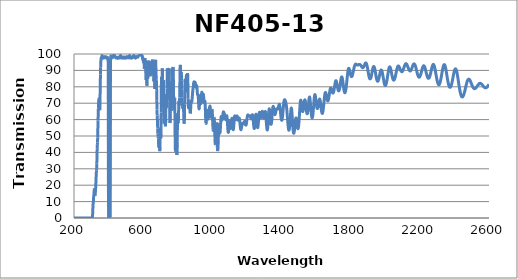
| Category | Transmission (%) |
|---|---|
| 2600.0 | 81.505 |
| 2599.0 | 81.325 |
| 2598.0 | 81.17 |
| 2597.0 | 81.029 |
| 2596.0 | 80.885 |
| 2595.0 | 80.709 |
| 2594.0 | 80.532 |
| 2593.0 | 80.373 |
| 2592.0 | 80.257 |
| 2591.0 | 80.102 |
| 2590.0 | 80.004 |
| 2589.0 | 79.88 |
| 2588.0 | 79.753 |
| 2587.0 | 79.691 |
| 2586.0 | 79.643 |
| 2585.0 | 79.518 |
| 2584.0 | 79.455 |
| 2583.0 | 79.403 |
| 2582.0 | 79.368 |
| 2581.0 | 79.414 |
| 2580.0 | 79.416 |
| 2579.0 | 79.408 |
| 2578.0 | 79.425 |
| 2577.0 | 79.477 |
| 2576.0 | 79.51 |
| 2575.0 | 79.573 |
| 2574.0 | 79.657 |
| 2573.0 | 79.706 |
| 2572.0 | 79.767 |
| 2571.0 | 79.872 |
| 2570.0 | 79.978 |
| 2569.0 | 80.113 |
| 2568.0 | 80.265 |
| 2567.0 | 80.411 |
| 2566.0 | 80.523 |
| 2565.0 | 80.657 |
| 2564.0 | 80.805 |
| 2563.0 | 80.95 |
| 2562.0 | 81.07 |
| 2561.0 | 81.199 |
| 2560.0 | 81.279 |
| 2559.0 | 81.383 |
| 2558.0 | 81.515 |
| 2557.0 | 81.59 |
| 2556.0 | 81.71 |
| 2555.0 | 81.803 |
| 2554.0 | 81.86 |
| 2553.0 | 81.938 |
| 2552.0 | 82.026 |
| 2551.0 | 82.08 |
| 2550.0 | 82.109 |
| 2549.0 | 82.13 |
| 2548.0 | 82.127 |
| 2547.0 | 82.061 |
| 2546.0 | 82.042 |
| 2545.0 | 82.046 |
| 2544.0 | 81.984 |
| 2543.0 | 81.902 |
| 2542.0 | 81.758 |
| 2541.0 | 81.629 |
| 2540.0 | 81.528 |
| 2539.0 | 81.471 |
| 2538.0 | 81.338 |
| 2537.0 | 81.219 |
| 2536.0 | 81.086 |
| 2535.0 | 80.915 |
| 2534.0 | 80.765 |
| 2533.0 | 80.627 |
| 2532.0 | 80.444 |
| 2531.0 | 80.249 |
| 2530.0 | 80.106 |
| 2529.0 | 79.963 |
| 2528.0 | 79.822 |
| 2527.0 | 79.716 |
| 2526.0 | 79.588 |
| 2525.0 | 79.464 |
| 2524.0 | 79.321 |
| 2523.0 | 79.19 |
| 2522.0 | 79.11 |
| 2521.0 | 79.058 |
| 2520.0 | 78.983 |
| 2519.0 | 78.946 |
| 2518.0 | 78.883 |
| 2517.0 | 78.867 |
| 2516.0 | 78.882 |
| 2515.0 | 78.927 |
| 2514.0 | 78.976 |
| 2513.0 | 79.034 |
| 2512.0 | 79.098 |
| 2511.0 | 79.187 |
| 2510.0 | 79.292 |
| 2509.0 | 79.455 |
| 2508.0 | 79.605 |
| 2507.0 | 79.755 |
| 2506.0 | 79.957 |
| 2505.0 | 80.179 |
| 2504.0 | 80.404 |
| 2503.0 | 80.652 |
| 2502.0 | 80.933 |
| 2501.0 | 81.179 |
| 2500.0 | 81.432 |
| 2499.0 | 81.675 |
| 2498.0 | 81.961 |
| 2497.0 | 82.24 |
| 2496.0 | 82.509 |
| 2495.0 | 82.776 |
| 2494.0 | 83.036 |
| 2493.0 | 83.261 |
| 2492.0 | 83.491 |
| 2491.0 | 83.715 |
| 2490.0 | 83.932 |
| 2489.0 | 84.124 |
| 2488.0 | 84.285 |
| 2487.0 | 84.411 |
| 2486.0 | 84.506 |
| 2485.0 | 84.6 |
| 2484.0 | 84.663 |
| 2483.0 | 84.667 |
| 2482.0 | 84.665 |
| 2481.0 | 84.608 |
| 2480.0 | 84.511 |
| 2479.0 | 84.399 |
| 2478.0 | 84.261 |
| 2477.0 | 84.068 |
| 2476.0 | 83.877 |
| 2475.0 | 83.631 |
| 2474.0 | 83.328 |
| 2473.0 | 83.002 |
| 2472.0 | 82.655 |
| 2471.0 | 82.271 |
| 2470.0 | 81.857 |
| 2469.0 | 81.446 |
| 2468.0 | 81.026 |
| 2467.0 | 80.596 |
| 2466.0 | 80.125 |
| 2465.0 | 79.645 |
| 2464.0 | 79.175 |
| 2463.0 | 78.736 |
| 2462.0 | 78.271 |
| 2461.0 | 77.819 |
| 2460.0 | 77.394 |
| 2459.0 | 76.996 |
| 2458.0 | 76.594 |
| 2457.0 | 76.221 |
| 2456.0 | 75.868 |
| 2455.0 | 75.517 |
| 2454.0 | 75.199 |
| 2453.0 | 74.909 |
| 2452.0 | 74.654 |
| 2451.0 | 74.422 |
| 2450.0 | 74.24 |
| 2449.0 | 74.1 |
| 2448.0 | 73.976 |
| 2447.0 | 73.879 |
| 2446.0 | 73.823 |
| 2445.0 | 73.828 |
| 2444.0 | 73.857 |
| 2443.0 | 73.939 |
| 2442.0 | 74.049 |
| 2441.0 | 74.206 |
| 2440.0 | 74.399 |
| 2439.0 | 74.628 |
| 2438.0 | 74.918 |
| 2437.0 | 75.265 |
| 2436.0 | 75.65 |
| 2435.0 | 76.057 |
| 2434.0 | 76.501 |
| 2433.0 | 76.994 |
| 2432.0 | 77.513 |
| 2431.0 | 78.064 |
| 2430.0 | 78.665 |
| 2429.0 | 79.292 |
| 2428.0 | 79.911 |
| 2427.0 | 80.556 |
| 2426.0 | 81.233 |
| 2425.0 | 81.949 |
| 2424.0 | 82.669 |
| 2423.0 | 83.368 |
| 2422.0 | 84.075 |
| 2421.0 | 84.778 |
| 2420.0 | 85.47 |
| 2419.0 | 86.127 |
| 2418.0 | 86.767 |
| 2417.0 | 87.406 |
| 2416.0 | 87.996 |
| 2415.0 | 88.53 |
| 2414.0 | 89.01 |
| 2413.0 | 89.428 |
| 2412.0 | 89.811 |
| 2411.0 | 90.143 |
| 2410.0 | 90.417 |
| 2409.0 | 90.65 |
| 2408.0 | 90.827 |
| 2407.0 | 90.922 |
| 2406.0 | 90.951 |
| 2405.0 | 90.899 |
| 2404.0 | 90.793 |
| 2403.0 | 90.626 |
| 2402.0 | 90.402 |
| 2401.0 | 90.124 |
| 2400.0 | 89.799 |
| 2399.0 | 89.415 |
| 2398.0 | 88.984 |
| 2397.0 | 88.524 |
| 2396.0 | 88.029 |
| 2395.0 | 87.504 |
| 2394.0 | 86.965 |
| 2393.0 | 86.405 |
| 2392.0 | 85.833 |
| 2391.0 | 85.267 |
| 2390.0 | 84.705 |
| 2389.0 | 84.138 |
| 2388.0 | 83.595 |
| 2387.0 | 83.078 |
| 2386.0 | 82.586 |
| 2385.0 | 82.103 |
| 2384.0 | 81.663 |
| 2383.0 | 81.265 |
| 2382.0 | 80.892 |
| 2381.0 | 80.572 |
| 2380.0 | 80.294 |
| 2379.0 | 80.064 |
| 2378.0 | 79.902 |
| 2377.0 | 79.772 |
| 2376.0 | 79.693 |
| 2375.0 | 79.665 |
| 2374.0 | 79.679 |
| 2373.0 | 79.739 |
| 2372.0 | 79.866 |
| 2371.0 | 80.029 |
| 2370.0 | 80.21 |
| 2369.0 | 80.454 |
| 2368.0 | 80.756 |
| 2367.0 | 81.091 |
| 2366.0 | 81.476 |
| 2365.0 | 81.931 |
| 2364.0 | 82.432 |
| 2363.0 | 82.922 |
| 2362.0 | 83.446 |
| 2361.0 | 84.02 |
| 2360.0 | 84.632 |
| 2359.0 | 85.286 |
| 2358.0 | 85.937 |
| 2357.0 | 86.585 |
| 2356.0 | 87.237 |
| 2355.0 | 87.923 |
| 2354.0 | 88.568 |
| 2353.0 | 89.222 |
| 2352.0 | 89.856 |
| 2351.0 | 90.472 |
| 2350.0 | 91.02 |
| 2349.0 | 91.53 |
| 2348.0 | 91.994 |
| 2347.0 | 92.431 |
| 2346.0 | 92.778 |
| 2345.0 | 93.046 |
| 2344.0 | 93.255 |
| 2343.0 | 93.433 |
| 2342.0 | 93.522 |
| 2341.0 | 93.52 |
| 2340.0 | 93.434 |
| 2339.0 | 93.32 |
| 2338.0 | 93.139 |
| 2337.0 | 92.886 |
| 2336.0 | 92.553 |
| 2335.0 | 92.158 |
| 2334.0 | 91.75 |
| 2333.0 | 91.283 |
| 2332.0 | 90.784 |
| 2331.0 | 90.245 |
| 2330.0 | 89.708 |
| 2329.0 | 89.118 |
| 2328.0 | 88.506 |
| 2327.0 | 87.868 |
| 2326.0 | 87.291 |
| 2325.0 | 86.664 |
| 2324.0 | 86.088 |
| 2323.0 | 85.506 |
| 2322.0 | 84.932 |
| 2321.0 | 84.404 |
| 2320.0 | 83.891 |
| 2319.0 | 83.404 |
| 2318.0 | 82.998 |
| 2317.0 | 82.629 |
| 2316.0 | 82.276 |
| 2315.0 | 81.95 |
| 2314.0 | 81.702 |
| 2313.0 | 81.476 |
| 2312.0 | 81.338 |
| 2311.0 | 81.286 |
| 2310.0 | 81.269 |
| 2309.0 | 81.293 |
| 2308.0 | 81.341 |
| 2307.0 | 81.485 |
| 2306.0 | 81.677 |
| 2305.0 | 81.931 |
| 2304.0 | 82.213 |
| 2303.0 | 82.566 |
| 2302.0 | 82.92 |
| 2301.0 | 83.36 |
| 2300.0 | 83.825 |
| 2299.0 | 84.349 |
| 2298.0 | 84.864 |
| 2297.0 | 85.427 |
| 2296.0 | 86.002 |
| 2295.0 | 86.581 |
| 2294.0 | 87.191 |
| 2293.0 | 87.789 |
| 2292.0 | 88.376 |
| 2291.0 | 88.966 |
| 2290.0 | 89.537 |
| 2289.0 | 90.091 |
| 2288.0 | 90.642 |
| 2287.0 | 91.156 |
| 2286.0 | 91.634 |
| 2285.0 | 92.08 |
| 2284.0 | 92.471 |
| 2283.0 | 92.81 |
| 2282.0 | 93.115 |
| 2281.0 | 93.344 |
| 2280.0 | 93.5 |
| 2279.0 | 93.62 |
| 2278.0 | 93.677 |
| 2277.0 | 93.631 |
| 2276.0 | 93.508 |
| 2275.0 | 93.35 |
| 2274.0 | 93.147 |
| 2273.0 | 92.903 |
| 2272.0 | 92.579 |
| 2271.0 | 92.209 |
| 2270.0 | 91.84 |
| 2269.0 | 91.4 |
| 2268.0 | 90.937 |
| 2267.0 | 90.468 |
| 2266.0 | 90.032 |
| 2265.0 | 89.496 |
| 2264.0 | 89.024 |
| 2263.0 | 88.556 |
| 2262.0 | 88.095 |
| 2261.0 | 87.675 |
| 2260.0 | 87.276 |
| 2259.0 | 86.876 |
| 2258.0 | 86.531 |
| 2257.0 | 86.218 |
| 2256.0 | 85.915 |
| 2255.0 | 85.703 |
| 2254.0 | 85.489 |
| 2253.0 | 85.335 |
| 2252.0 | 85.246 |
| 2251.0 | 85.195 |
| 2250.0 | 85.169 |
| 2249.0 | 85.183 |
| 2248.0 | 85.266 |
| 2247.0 | 85.405 |
| 2246.0 | 85.595 |
| 2245.0 | 85.775 |
| 2244.0 | 85.998 |
| 2243.0 | 86.243 |
| 2242.0 | 86.615 |
| 2241.0 | 86.948 |
| 2240.0 | 87.346 |
| 2239.0 | 87.733 |
| 2238.0 | 88.147 |
| 2237.0 | 88.592 |
| 2236.0 | 89.016 |
| 2235.0 | 89.464 |
| 2234.0 | 89.933 |
| 2233.0 | 90.358 |
| 2232.0 | 90.762 |
| 2231.0 | 91.135 |
| 2230.0 | 91.485 |
| 2229.0 | 91.822 |
| 2228.0 | 92.101 |
| 2227.0 | 92.36 |
| 2226.0 | 92.547 |
| 2225.0 | 92.667 |
| 2224.0 | 92.784 |
| 2223.0 | 92.824 |
| 2222.0 | 92.825 |
| 2221.0 | 92.78 |
| 2220.0 | 92.629 |
| 2219.0 | 92.437 |
| 2218.0 | 92.26 |
| 2217.0 | 91.982 |
| 2216.0 | 91.714 |
| 2215.0 | 91.404 |
| 2214.0 | 91.047 |
| 2213.0 | 90.668 |
| 2212.0 | 90.323 |
| 2211.0 | 89.85 |
| 2210.0 | 89.45 |
| 2209.0 | 89.045 |
| 2208.0 | 88.653 |
| 2207.0 | 88.267 |
| 2206.0 | 87.926 |
| 2205.0 | 87.549 |
| 2204.0 | 87.228 |
| 2203.0 | 86.936 |
| 2202.0 | 86.673 |
| 2201.0 | 86.442 |
| 2200.0 | 86.254 |
| 2199.0 | 86.066 |
| 2198.0 | 85.96 |
| 2197.0 | 85.886 |
| 2196.0 | 85.871 |
| 2195.0 | 85.873 |
| 2194.0 | 85.923 |
| 2193.0 | 86.076 |
| 2192.0 | 86.207 |
| 2191.0 | 86.397 |
| 2190.0 | 86.634 |
| 2189.0 | 86.908 |
| 2188.0 | 87.21 |
| 2187.0 | 87.525 |
| 2186.0 | 87.913 |
| 2185.0 | 88.317 |
| 2184.0 | 88.72 |
| 2183.0 | 89.176 |
| 2182.0 | 89.619 |
| 2181.0 | 90.054 |
| 2180.0 | 90.512 |
| 2179.0 | 90.931 |
| 2178.0 | 91.335 |
| 2177.0 | 91.761 |
| 2176.0 | 92.131 |
| 2175.0 | 92.507 |
| 2174.0 | 92.831 |
| 2173.0 | 93.097 |
| 2172.0 | 93.356 |
| 2171.0 | 93.554 |
| 2170.0 | 93.707 |
| 2169.0 | 93.842 |
| 2168.0 | 93.918 |
| 2167.0 | 93.982 |
| 2166.0 | 93.955 |
| 2165.0 | 93.922 |
| 2164.0 | 93.813 |
| 2163.0 | 93.669 |
| 2162.0 | 93.48 |
| 2161.0 | 93.247 |
| 2160.0 | 93.051 |
| 2159.0 | 92.78 |
| 2158.0 | 92.527 |
| 2157.0 | 92.229 |
| 2156.0 | 91.919 |
| 2155.0 | 91.62 |
| 2154.0 | 91.31 |
| 2153.0 | 91.038 |
| 2152.0 | 90.786 |
| 2151.0 | 90.55 |
| 2150.0 | 90.323 |
| 2149.0 | 90.13 |
| 2148.0 | 89.964 |
| 2147.0 | 89.812 |
| 2146.0 | 89.735 |
| 2145.0 | 89.673 |
| 2144.0 | 89.657 |
| 2143.0 | 89.671 |
| 2142.0 | 89.72 |
| 2141.0 | 89.806 |
| 2140.0 | 89.933 |
| 2139.0 | 90.066 |
| 2138.0 | 90.257 |
| 2137.0 | 90.47 |
| 2136.0 | 90.693 |
| 2135.0 | 90.958 |
| 2134.0 | 91.221 |
| 2133.0 | 91.495 |
| 2132.0 | 91.777 |
| 2131.0 | 92.078 |
| 2130.0 | 92.375 |
| 2129.0 | 92.673 |
| 2128.0 | 92.894 |
| 2127.0 | 93.145 |
| 2126.0 | 93.387 |
| 2125.0 | 93.62 |
| 2124.0 | 93.807 |
| 2123.0 | 93.931 |
| 2122.0 | 94.027 |
| 2121.0 | 94.088 |
| 2120.0 | 94.12 |
| 2119.0 | 94.115 |
| 2118.0 | 94.046 |
| 2117.0 | 93.924 |
| 2116.0 | 93.768 |
| 2115.0 | 93.599 |
| 2114.0 | 93.392 |
| 2113.0 | 93.168 |
| 2112.0 | 92.896 |
| 2111.0 | 92.582 |
| 2110.0 | 92.283 |
| 2109.0 | 91.966 |
| 2108.0 | 91.624 |
| 2107.0 | 91.301 |
| 2106.0 | 91.007 |
| 2105.0 | 90.713 |
| 2104.0 | 90.436 |
| 2103.0 | 90.165 |
| 2102.0 | 89.909 |
| 2101.0 | 89.713 |
| 2100.0 | 89.541 |
| 2099.0 | 89.406 |
| 2098.0 | 89.297 |
| 2097.0 | 89.21 |
| 2096.0 | 89.199 |
| 2095.0 | 89.224 |
| 2094.0 | 89.289 |
| 2093.0 | 89.397 |
| 2092.0 | 89.531 |
| 2091.0 | 89.672 |
| 2090.0 | 89.82 |
| 2089.0 | 89.996 |
| 2088.0 | 90.218 |
| 2087.0 | 90.509 |
| 2086.0 | 90.782 |
| 2085.0 | 91.065 |
| 2084.0 | 91.31 |
| 2083.0 | 91.564 |
| 2082.0 | 91.793 |
| 2081.0 | 92.022 |
| 2080.0 | 92.269 |
| 2079.0 | 92.462 |
| 2078.0 | 92.597 |
| 2077.0 | 92.691 |
| 2076.0 | 92.731 |
| 2075.0 | 92.71 |
| 2074.0 | 92.637 |
| 2073.0 | 92.522 |
| 2072.0 | 92.366 |
| 2071.0 | 92.118 |
| 2070.0 | 91.825 |
| 2069.0 | 91.478 |
| 2068.0 | 91.078 |
| 2067.0 | 90.654 |
| 2066.0 | 90.193 |
| 2065.0 | 89.69 |
| 2064.0 | 89.182 |
| 2063.0 | 88.652 |
| 2062.0 | 88.115 |
| 2061.0 | 87.611 |
| 2060.0 | 87.128 |
| 2059.0 | 86.646 |
| 2058.0 | 86.181 |
| 2057.0 | 85.746 |
| 2056.0 | 85.338 |
| 2055.0 | 84.996 |
| 2054.0 | 84.741 |
| 2053.0 | 84.511 |
| 2052.0 | 84.299 |
| 2051.0 | 84.145 |
| 2050.0 | 84.072 |
| 2049.0 | 84.042 |
| 2048.0 | 84.071 |
| 2047.0 | 84.171 |
| 2046.0 | 84.346 |
| 2045.0 | 84.565 |
| 2044.0 | 84.823 |
| 2043.0 | 85.153 |
| 2042.0 | 85.554 |
| 2041.0 | 86.015 |
| 2040.0 | 86.502 |
| 2039.0 | 86.973 |
| 2038.0 | 87.482 |
| 2037.0 | 88.023 |
| 2036.0 | 88.598 |
| 2035.0 | 89.177 |
| 2034.0 | 89.708 |
| 2033.0 | 90.196 |
| 2032.0 | 90.659 |
| 2031.0 | 91.089 |
| 2030.0 | 91.445 |
| 2029.0 | 91.746 |
| 2028.0 | 91.975 |
| 2027.0 | 92.117 |
| 2026.0 | 92.162 |
| 2025.0 | 92.107 |
| 2024.0 | 91.984 |
| 2023.0 | 91.776 |
| 2022.0 | 91.469 |
| 2021.0 | 91.082 |
| 2020.0 | 90.583 |
| 2019.0 | 90.011 |
| 2018.0 | 89.407 |
| 2017.0 | 88.752 |
| 2016.0 | 88.108 |
| 2015.0 | 87.445 |
| 2014.0 | 86.761 |
| 2013.0 | 86.085 |
| 2012.0 | 85.383 |
| 2011.0 | 84.731 |
| 2010.0 | 84.12 |
| 2009.0 | 83.534 |
| 2008.0 | 82.977 |
| 2007.0 | 82.463 |
| 2006.0 | 82.01 |
| 2005.0 | 81.628 |
| 2004.0 | 81.321 |
| 2003.0 | 81.071 |
| 2002.0 | 80.902 |
| 2001.0 | 80.811 |
| 2000.0 | 80.783 |
| 1999.0 | 80.832 |
| 1998.0 | 80.968 |
| 1997.0 | 81.2 |
| 1996.0 | 81.491 |
| 1995.0 | 81.842 |
| 1994.0 | 82.261 |
| 1993.0 | 82.78 |
| 1992.0 | 83.34 |
| 1991.0 | 83.91 |
| 1990.0 | 84.527 |
| 1989.0 | 85.172 |
| 1988.0 | 85.806 |
| 1987.0 | 86.436 |
| 1986.0 | 87.053 |
| 1985.0 | 87.657 |
| 1984.0 | 88.236 |
| 1983.0 | 88.751 |
| 1982.0 | 89.198 |
| 1981.0 | 89.582 |
| 1980.0 | 89.881 |
| 1979.0 | 90.078 |
| 1978.0 | 90.212 |
| 1977.0 | 90.269 |
| 1976.0 | 90.254 |
| 1975.0 | 90.134 |
| 1974.0 | 89.926 |
| 1973.0 | 89.647 |
| 1972.0 | 89.301 |
| 1971.0 | 88.906 |
| 1970.0 | 88.434 |
| 1969.0 | 87.938 |
| 1968.0 | 87.451 |
| 1967.0 | 86.967 |
| 1966.0 | 86.441 |
| 1965.0 | 85.919 |
| 1964.0 | 85.417 |
| 1963.0 | 84.992 |
| 1962.0 | 84.55 |
| 1961.0 | 84.181 |
| 1960.0 | 83.904 |
| 1959.0 | 83.68 |
| 1958.0 | 83.479 |
| 1957.0 | 83.374 |
| 1956.0 | 83.357 |
| 1955.0 | 83.404 |
| 1954.0 | 83.526 |
| 1953.0 | 83.758 |
| 1952.0 | 84.025 |
| 1951.0 | 84.372 |
| 1950.0 | 84.778 |
| 1949.0 | 85.29 |
| 1948.0 | 85.779 |
| 1947.0 | 86.368 |
| 1946.0 | 86.995 |
| 1945.0 | 87.593 |
| 1944.0 | 88.262 |
| 1943.0 | 88.885 |
| 1942.0 | 89.445 |
| 1941.0 | 90.051 |
| 1940.0 | 90.615 |
| 1939.0 | 91.135 |
| 1938.0 | 91.515 |
| 1937.0 | 91.824 |
| 1936.0 | 92.082 |
| 1935.0 | 92.285 |
| 1934.0 | 92.384 |
| 1933.0 | 92.388 |
| 1932.0 | 92.29 |
| 1931.0 | 92.096 |
| 1930.0 | 91.86 |
| 1929.0 | 91.542 |
| 1928.0 | 91.113 |
| 1927.0 | 90.635 |
| 1926.0 | 90.115 |
| 1925.0 | 89.559 |
| 1924.0 | 89.024 |
| 1923.0 | 88.507 |
| 1922.0 | 87.985 |
| 1921.0 | 87.402 |
| 1920.0 | 86.801 |
| 1919.0 | 86.281 |
| 1918.0 | 85.857 |
| 1917.0 | 85.467 |
| 1916.0 | 85.239 |
| 1915.0 | 85.085 |
| 1914.0 | 84.956 |
| 1913.0 | 84.851 |
| 1912.0 | 84.801 |
| 1911.0 | 84.857 |
| 1910.0 | 84.981 |
| 1909.0 | 85.197 |
| 1908.0 | 85.51 |
| 1907.0 | 85.846 |
| 1906.0 | 86.362 |
| 1905.0 | 86.854 |
| 1904.0 | 87.409 |
| 1903.0 | 87.961 |
| 1902.0 | 88.543 |
| 1901.0 | 89.161 |
| 1900.0 | 89.839 |
| 1899.0 | 90.473 |
| 1898.0 | 91.148 |
| 1897.0 | 91.701 |
| 1896.0 | 92.193 |
| 1895.0 | 92.663 |
| 1894.0 | 93.124 |
| 1893.0 | 93.532 |
| 1892.0 | 93.876 |
| 1891.0 | 94.156 |
| 1890.0 | 94.328 |
| 1889.0 | 94.433 |
| 1888.0 | 94.519 |
| 1887.0 | 94.535 |
| 1886.0 | 94.472 |
| 1885.0 | 94.388 |
| 1884.0 | 94.213 |
| 1883.0 | 93.964 |
| 1882.0 | 93.768 |
| 1881.0 | 93.538 |
| 1880.0 | 93.245 |
| 1879.0 | 93.034 |
| 1878.0 | 92.809 |
| 1877.0 | 92.557 |
| 1876.0 | 92.334 |
| 1875.0 | 92.173 |
| 1874.0 | 91.978 |
| 1873.0 | 91.878 |
| 1872.0 | 91.741 |
| 1871.0 | 91.657 |
| 1870.0 | 91.628 |
| 1869.0 | 91.721 |
| 1868.0 | 91.719 |
| 1867.0 | 91.835 |
| 1866.0 | 91.926 |
| 1865.0 | 92.06 |
| 1864.0 | 92.22 |
| 1863.0 | 92.407 |
| 1862.0 | 92.635 |
| 1861.0 | 92.782 |
| 1860.0 | 92.924 |
| 1859.0 | 93.09 |
| 1858.0 | 93.209 |
| 1857.0 | 93.351 |
| 1856.0 | 93.439 |
| 1855.0 | 93.469 |
| 1854.0 | 93.54 |
| 1853.0 | 93.569 |
| 1852.0 | 93.596 |
| 1851.0 | 93.592 |
| 1850.0 | 93.614 |
| 1849.0 | 93.581 |
| 1848.0 | 93.616 |
| 1847.0 | 93.51 |
| 1846.0 | 93.425 |
| 1845.0 | 93.42 |
| 1844.0 | 93.274 |
| 1843.0 | 93.289 |
| 1842.0 | 93.339 |
| 1841.0 | 93.259 |
| 1840.0 | 93.305 |
| 1839.0 | 93.35 |
| 1838.0 | 93.29 |
| 1837.0 | 93.367 |
| 1836.0 | 93.456 |
| 1835.0 | 93.534 |
| 1834.0 | 93.605 |
| 1833.0 | 93.662 |
| 1832.0 | 93.757 |
| 1831.0 | 93.806 |
| 1830.0 | 93.851 |
| 1829.0 | 93.818 |
| 1828.0 | 93.796 |
| 1827.0 | 93.708 |
| 1826.0 | 93.586 |
| 1825.0 | 93.35 |
| 1824.0 | 93.041 |
| 1823.0 | 92.855 |
| 1822.0 | 92.636 |
| 1821.0 | 92.256 |
| 1820.0 | 91.802 |
| 1819.0 | 91.208 |
| 1818.0 | 90.741 |
| 1817.0 | 90.236 |
| 1816.0 | 89.799 |
| 1815.0 | 89.3 |
| 1814.0 | 88.769 |
| 1813.0 | 88.298 |
| 1812.0 | 87.837 |
| 1811.0 | 87.437 |
| 1810.0 | 87.051 |
| 1809.0 | 86.741 |
| 1808.0 | 86.522 |
| 1807.0 | 86.348 |
| 1806.0 | 86.2 |
| 1805.0 | 86.202 |
| 1804.0 | 86.275 |
| 1803.0 | 86.407 |
| 1802.0 | 86.598 |
| 1801.0 | 86.866 |
| 1800.0 | 87.245 |
| 1799.0 | 87.662 |
| 1798.0 | 88.139 |
| 1797.0 | 88.63 |
| 1796.0 | 89.092 |
| 1795.0 | 89.577 |
| 1794.0 | 90.019 |
| 1793.0 | 90.448 |
| 1792.0 | 90.791 |
| 1791.0 | 91.057 |
| 1790.0 | 91.209 |
| 1789.0 | 91.268 |
| 1788.0 | 91.171 |
| 1787.0 | 90.912 |
| 1786.0 | 90.515 |
| 1785.0 | 89.964 |
| 1784.0 | 89.316 |
| 1783.0 | 88.544 |
| 1782.0 | 87.661 |
| 1781.0 | 86.766 |
| 1780.0 | 85.75 |
| 1779.0 | 84.66 |
| 1778.0 | 83.572 |
| 1777.0 | 82.538 |
| 1776.0 | 81.513 |
| 1775.0 | 80.606 |
| 1774.0 | 79.73 |
| 1773.0 | 78.948 |
| 1772.0 | 78.243 |
| 1771.0 | 77.657 |
| 1770.0 | 77.147 |
| 1769.0 | 76.775 |
| 1768.0 | 76.53 |
| 1767.0 | 76.388 |
| 1766.0 | 76.367 |
| 1765.0 | 76.512 |
| 1764.0 | 76.772 |
| 1763.0 | 77.142 |
| 1762.0 | 77.62 |
| 1761.0 | 78.216 |
| 1760.0 | 78.901 |
| 1759.0 | 79.647 |
| 1758.0 | 80.469 |
| 1757.0 | 81.303 |
| 1756.0 | 82.153 |
| 1755.0 | 82.988 |
| 1754.0 | 83.75 |
| 1753.0 | 84.467 |
| 1752.0 | 85.085 |
| 1751.0 | 85.523 |
| 1750.0 | 85.843 |
| 1749.0 | 86.014 |
| 1748.0 | 86.022 |
| 1747.0 | 85.879 |
| 1746.0 | 85.583 |
| 1745.0 | 85.155 |
| 1744.0 | 84.572 |
| 1743.0 | 83.941 |
| 1742.0 | 83.217 |
| 1741.0 | 82.468 |
| 1740.0 | 81.699 |
| 1739.0 | 80.974 |
| 1738.0 | 80.239 |
| 1737.0 | 79.58 |
| 1736.0 | 79.008 |
| 1735.0 | 78.523 |
| 1734.0 | 78.098 |
| 1733.0 | 77.807 |
| 1732.0 | 77.601 |
| 1731.0 | 77.486 |
| 1730.0 | 77.528 |
| 1729.0 | 77.669 |
| 1728.0 | 77.929 |
| 1727.0 | 78.273 |
| 1726.0 | 78.693 |
| 1725.0 | 79.165 |
| 1724.0 | 79.71 |
| 1723.0 | 80.335 |
| 1722.0 | 80.958 |
| 1721.0 | 81.585 |
| 1720.0 | 82.178 |
| 1719.0 | 82.659 |
| 1718.0 | 83.07 |
| 1717.0 | 83.414 |
| 1716.0 | 83.63 |
| 1715.0 | 83.724 |
| 1714.0 | 83.682 |
| 1713.0 | 83.459 |
| 1712.0 | 83.115 |
| 1711.0 | 82.67 |
| 1710.0 | 82.12 |
| 1709.0 | 81.507 |
| 1708.0 | 80.845 |
| 1707.0 | 80.175 |
| 1706.0 | 79.494 |
| 1705.0 | 78.818 |
| 1704.0 | 78.181 |
| 1703.0 | 77.62 |
| 1702.0 | 77.126 |
| 1701.0 | 76.755 |
| 1700.0 | 76.463 |
| 1699.0 | 76.265 |
| 1698.0 | 76.158 |
| 1697.0 | 76.163 |
| 1696.0 | 76.258 |
| 1695.0 | 76.472 |
| 1694.0 | 76.742 |
| 1693.0 | 77.035 |
| 1692.0 | 77.385 |
| 1691.0 | 77.746 |
| 1690.0 | 78.118 |
| 1689.0 | 78.471 |
| 1688.0 | 78.798 |
| 1687.0 | 79.058 |
| 1686.0 | 79.214 |
| 1685.0 | 79.257 |
| 1684.0 | 79.212 |
| 1683.0 | 79.056 |
| 1682.0 | 78.768 |
| 1681.0 | 78.354 |
| 1680.0 | 77.829 |
| 1679.0 | 77.202 |
| 1678.0 | 76.515 |
| 1677.0 | 75.799 |
| 1676.0 | 75.061 |
| 1675.0 | 74.33 |
| 1674.0 | 73.626 |
| 1673.0 | 73.009 |
| 1672.0 | 72.484 |
| 1671.0 | 72.026 |
| 1670.0 | 71.68 |
| 1669.0 | 71.453 |
| 1668.0 | 71.355 |
| 1667.0 | 71.393 |
| 1666.0 | 71.542 |
| 1665.0 | 71.818 |
| 1664.0 | 72.216 |
| 1663.0 | 72.696 |
| 1662.0 | 73.242 |
| 1661.0 | 73.841 |
| 1660.0 | 74.427 |
| 1659.0 | 74.999 |
| 1658.0 | 75.543 |
| 1657.0 | 75.973 |
| 1656.0 | 76.305 |
| 1655.0 | 76.519 |
| 1654.0 | 76.555 |
| 1653.0 | 76.414 |
| 1652.0 | 76.089 |
| 1651.0 | 75.575 |
| 1650.0 | 74.906 |
| 1649.0 | 74.108 |
| 1648.0 | 73.207 |
| 1647.0 | 72.169 |
| 1646.0 | 71.081 |
| 1645.0 | 70.002 |
| 1644.0 | 68.895 |
| 1643.0 | 67.853 |
| 1642.0 | 66.872 |
| 1641.0 | 65.984 |
| 1640.0 | 65.218 |
| 1639.0 | 64.597 |
| 1638.0 | 64.148 |
| 1637.0 | 63.861 |
| 1636.0 | 63.756 |
| 1635.0 | 63.816 |
| 1634.0 | 64.034 |
| 1633.0 | 64.441 |
| 1632.0 | 64.968 |
| 1631.0 | 65.612 |
| 1630.0 | 66.378 |
| 1629.0 | 67.207 |
| 1628.0 | 68.089 |
| 1627.0 | 68.99 |
| 1626.0 | 69.854 |
| 1625.0 | 70.661 |
| 1624.0 | 71.367 |
| 1623.0 | 71.919 |
| 1622.0 | 72.294 |
| 1621.0 | 72.486 |
| 1620.0 | 72.508 |
| 1619.0 | 72.334 |
| 1618.0 | 71.994 |
| 1617.0 | 71.524 |
| 1616.0 | 70.955 |
| 1615.0 | 70.325 |
| 1614.0 | 69.647 |
| 1613.0 | 68.967 |
| 1612.0 | 68.334 |
| 1611.0 | 67.769 |
| 1610.0 | 67.306 |
| 1609.0 | 66.964 |
| 1608.0 | 66.772 |
| 1607.0 | 66.742 |
| 1606.0 | 66.862 |
| 1605.0 | 67.152 |
| 1604.0 | 67.587 |
| 1603.0 | 68.183 |
| 1602.0 | 68.933 |
| 1601.0 | 69.785 |
| 1600.0 | 70.723 |
| 1599.0 | 71.707 |
| 1598.0 | 72.671 |
| 1597.0 | 73.563 |
| 1596.0 | 74.327 |
| 1595.0 | 74.878 |
| 1594.0 | 75.185 |
| 1593.0 | 75.231 |
| 1592.0 | 74.972 |
| 1591.0 | 74.433 |
| 1590.0 | 73.625 |
| 1589.0 | 72.576 |
| 1588.0 | 71.35 |
| 1587.0 | 69.993 |
| 1586.0 | 68.56 |
| 1585.0 | 67.162 |
| 1584.0 | 65.832 |
| 1583.0 | 64.62 |
| 1582.0 | 63.545 |
| 1581.0 | 62.614 |
| 1580.0 | 61.905 |
| 1579.0 | 61.414 |
| 1578.0 | 61.121 |
| 1577.0 | 61.05 |
| 1576.0 | 61.213 |
| 1575.0 | 61.603 |
| 1574.0 | 62.197 |
| 1573.0 | 63.019 |
| 1572.0 | 63.995 |
| 1571.0 | 65.102 |
| 1570.0 | 66.351 |
| 1569.0 | 67.66 |
| 1568.0 | 68.958 |
| 1567.0 | 70.217 |
| 1566.0 | 71.358 |
| 1565.0 | 72.392 |
| 1564.0 | 73.187 |
| 1563.0 | 73.661 |
| 1562.0 | 73.808 |
| 1561.0 | 73.623 |
| 1560.0 | 73.169 |
| 1559.0 | 72.419 |
| 1558.0 | 71.486 |
| 1557.0 | 70.355 |
| 1556.0 | 69.177 |
| 1555.0 | 68.003 |
| 1554.0 | 66.89 |
| 1553.0 | 65.866 |
| 1552.0 | 64.982 |
| 1551.0 | 64.341 |
| 1550.0 | 63.873 |
| 1549.0 | 63.606 |
| 1548.0 | 63.581 |
| 1547.0 | 63.767 |
| 1546.0 | 64.188 |
| 1545.0 | 64.789 |
| 1544.0 | 65.573 |
| 1543.0 | 66.473 |
| 1542.0 | 67.439 |
| 1541.0 | 68.498 |
| 1540.0 | 69.476 |
| 1539.0 | 70.365 |
| 1538.0 | 71.092 |
| 1537.0 | 71.646 |
| 1536.0 | 71.979 |
| 1535.0 | 72.06 |
| 1534.0 | 71.901 |
| 1533.0 | 71.503 |
| 1532.0 | 70.904 |
| 1531.0 | 70.188 |
| 1530.0 | 69.38 |
| 1529.0 | 68.461 |
| 1528.0 | 67.577 |
| 1527.0 | 66.72 |
| 1526.0 | 66.043 |
| 1525.0 | 65.479 |
| 1524.0 | 65.079 |
| 1523.0 | 64.886 |
| 1522.0 | 64.908 |
| 1521.0 | 65.158 |
| 1520.0 | 65.602 |
| 1519.0 | 66.299 |
| 1518.0 | 67.069 |
| 1517.0 | 67.984 |
| 1516.0 | 68.967 |
| 1515.0 | 69.905 |
| 1514.0 | 70.734 |
| 1513.0 | 71.392 |
| 1512.0 | 71.791 |
| 1511.0 | 71.832 |
| 1510.0 | 71.493 |
| 1509.0 | 70.767 |
| 1508.0 | 69.723 |
| 1507.0 | 68.341 |
| 1506.0 | 66.754 |
| 1505.0 | 65.118 |
| 1504.0 | 63.38 |
| 1503.0 | 61.655 |
| 1502.0 | 60.052 |
| 1501.0 | 58.54 |
| 1500.0 | 57.27 |
| 1499.0 | 56.243 |
| 1498.0 | 55.439 |
| 1497.0 | 54.848 |
| 1496.0 | 54.524 |
| 1495.0 | 54.46 |
| 1494.0 | 54.612 |
| 1493.0 | 54.968 |
| 1492.0 | 55.491 |
| 1491.0 | 56.231 |
| 1490.0 | 57.023 |
| 1489.0 | 57.903 |
| 1488.0 | 58.752 |
| 1487.0 | 59.625 |
| 1486.0 | 60.297 |
| 1485.0 | 60.814 |
| 1484.0 | 61.019 |
| 1483.0 | 60.944 |
| 1482.0 | 60.582 |
| 1481.0 | 59.947 |
| 1480.0 | 59.039 |
| 1479.0 | 57.973 |
| 1478.0 | 56.858 |
| 1477.0 | 55.703 |
| 1476.0 | 54.592 |
| 1475.0 | 53.51 |
| 1474.0 | 52.752 |
| 1473.0 | 52.129 |
| 1472.0 | 51.753 |
| 1471.0 | 51.619 |
| 1470.0 | 51.761 |
| 1469.0 | 52.202 |
| 1468.0 | 52.863 |
| 1467.0 | 53.869 |
| 1466.0 | 55.086 |
| 1465.0 | 56.548 |
| 1464.0 | 58.153 |
| 1463.0 | 59.863 |
| 1462.0 | 61.617 |
| 1461.0 | 63.328 |
| 1460.0 | 64.729 |
| 1459.0 | 65.919 |
| 1458.0 | 66.709 |
| 1457.0 | 67.027 |
| 1456.0 | 66.925 |
| 1455.0 | 66.36 |
| 1454.0 | 65.483 |
| 1453.0 | 64.218 |
| 1452.0 | 62.835 |
| 1451.0 | 61.286 |
| 1450.0 | 59.727 |
| 1449.0 | 58.209 |
| 1448.0 | 56.886 |
| 1447.0 | 55.675 |
| 1446.0 | 54.84 |
| 1445.0 | 54.189 |
| 1444.0 | 53.679 |
| 1443.0 | 53.504 |
| 1442.0 | 53.586 |
| 1441.0 | 53.966 |
| 1440.0 | 54.542 |
| 1439.0 | 55.43 |
| 1438.0 | 56.439 |
| 1437.0 | 57.619 |
| 1436.0 | 58.92 |
| 1435.0 | 60.29 |
| 1434.0 | 61.72 |
| 1433.0 | 63.141 |
| 1432.0 | 64.421 |
| 1431.0 | 65.646 |
| 1430.0 | 66.759 |
| 1429.0 | 67.714 |
| 1428.0 | 68.534 |
| 1427.0 | 69.26 |
| 1426.0 | 69.86 |
| 1425.0 | 70.402 |
| 1424.0 | 70.812 |
| 1423.0 | 71.19 |
| 1422.0 | 71.504 |
| 1421.0 | 71.758 |
| 1420.0 | 71.965 |
| 1419.0 | 72.108 |
| 1418.0 | 72.127 |
| 1417.0 | 72.03 |
| 1416.0 | 71.784 |
| 1415.0 | 71.423 |
| 1414.0 | 70.885 |
| 1413.0 | 70.045 |
| 1412.0 | 69.05 |
| 1411.0 | 67.996 |
| 1410.0 | 66.906 |
| 1409.0 | 65.717 |
| 1408.0 | 64.492 |
| 1407.0 | 63.214 |
| 1406.0 | 62.156 |
| 1405.0 | 61.242 |
| 1404.0 | 60.502 |
| 1403.0 | 59.933 |
| 1402.0 | 59.554 |
| 1401.0 | 59.604 |
| 1400.0 | 59.855 |
| 1399.0 | 60.241 |
| 1398.0 | 60.65 |
| 1397.0 | 61.36 |
| 1396.0 | 62.481 |
| 1395.0 | 63.592 |
| 1394.0 | 64.795 |
| 1393.0 | 65.773 |
| 1392.0 | 66.749 |
| 1391.0 | 67.746 |
| 1390.0 | 68.443 |
| 1389.0 | 68.956 |
| 1388.0 | 69.304 |
| 1387.0 | 69.278 |
| 1386.0 | 69.109 |
| 1385.0 | 68.786 |
| 1384.0 | 68.433 |
| 1383.0 | 68.059 |
| 1382.0 | 67.599 |
| 1381.0 | 67.062 |
| 1380.0 | 66.75 |
| 1379.0 | 66.592 |
| 1378.0 | 66.528 |
| 1377.0 | 66.551 |
| 1376.0 | 66.603 |
| 1375.0 | 66.705 |
| 1374.0 | 66.67 |
| 1373.0 | 66.614 |
| 1372.0 | 66.518 |
| 1371.0 | 66.355 |
| 1370.0 | 66.107 |
| 1369.0 | 65.653 |
| 1368.0 | 65.216 |
| 1367.0 | 64.698 |
| 1366.0 | 64.178 |
| 1365.0 | 63.765 |
| 1364.0 | 63.401 |
| 1363.0 | 63.101 |
| 1362.0 | 62.988 |
| 1361.0 | 63.042 |
| 1360.0 | 63.244 |
| 1359.0 | 63.544 |
| 1358.0 | 64.236 |
| 1357.0 | 65.028 |
| 1356.0 | 65.844 |
| 1355.0 | 66.78 |
| 1354.0 | 67.415 |
| 1353.0 | 67.873 |
| 1352.0 | 68.045 |
| 1351.0 | 67.951 |
| 1350.0 | 67.515 |
| 1349.0 | 66.738 |
| 1348.0 | 65.622 |
| 1347.0 | 64.278 |
| 1346.0 | 62.81 |
| 1345.0 | 61.297 |
| 1344.0 | 59.958 |
| 1343.0 | 58.873 |
| 1342.0 | 58.015 |
| 1341.0 | 57.398 |
| 1340.0 | 57.113 |
| 1339.0 | 57.178 |
| 1338.0 | 57.601 |
| 1337.0 | 58.33 |
| 1336.0 | 59.335 |
| 1335.0 | 60.573 |
| 1334.0 | 61.934 |
| 1333.0 | 63.333 |
| 1332.0 | 64.639 |
| 1331.0 | 65.724 |
| 1330.0 | 66.368 |
| 1329.0 | 66.559 |
| 1328.0 | 66.224 |
| 1327.0 | 65.379 |
| 1326.0 | 64.131 |
| 1325.0 | 62.536 |
| 1324.0 | 60.799 |
| 1323.0 | 59.036 |
| 1322.0 | 57.364 |
| 1321.0 | 55.934 |
| 1320.0 | 54.802 |
| 1319.0 | 54.024 |
| 1318.0 | 53.686 |
| 1317.0 | 53.734 |
| 1316.0 | 54.179 |
| 1315.0 | 55.009 |
| 1314.0 | 56.133 |
| 1313.0 | 57.501 |
| 1312.0 | 58.999 |
| 1311.0 | 60.596 |
| 1310.0 | 62.076 |
| 1309.0 | 63.343 |
| 1308.0 | 64.282 |
| 1307.0 | 64.812 |
| 1306.0 | 64.938 |
| 1305.0 | 64.708 |
| 1304.0 | 64.169 |
| 1303.0 | 63.454 |
| 1302.0 | 62.666 |
| 1301.0 | 61.948 |
| 1300.0 | 61.401 |
| 1299.0 | 61.043 |
| 1298.0 | 60.895 |
| 1297.0 | 60.979 |
| 1296.0 | 61.326 |
| 1295.0 | 61.851 |
| 1294.0 | 62.507 |
| 1293.0 | 63.236 |
| 1292.0 | 63.944 |
| 1291.0 | 64.531 |
| 1290.0 | 64.916 |
| 1289.0 | 65.073 |
| 1288.0 | 64.977 |
| 1287.0 | 64.628 |
| 1286.0 | 64.09 |
| 1285.0 | 63.42 |
| 1284.0 | 62.709 |
| 1283.0 | 62.041 |
| 1282.0 | 61.514 |
| 1281.0 | 61.213 |
| 1280.0 | 61.146 |
| 1279.0 | 61.321 |
| 1278.0 | 61.743 |
| 1277.0 | 62.343 |
| 1276.0 | 63.003 |
| 1275.0 | 63.633 |
| 1274.0 | 64.152 |
| 1273.0 | 64.42 |
| 1272.0 | 64.331 |
| 1271.0 | 63.861 |
| 1270.0 | 63.004 |
| 1269.0 | 61.849 |
| 1268.0 | 60.498 |
| 1267.0 | 59.1 |
| 1266.0 | 57.757 |
| 1265.0 | 56.57 |
| 1264.0 | 55.714 |
| 1263.0 | 55.205 |
| 1262.0 | 55.028 |
| 1261.0 | 55.233 |
| 1260.0 | 55.828 |
| 1259.0 | 56.711 |
| 1258.0 | 57.824 |
| 1257.0 | 59.099 |
| 1256.0 | 60.409 |
| 1255.0 | 61.625 |
| 1254.0 | 62.611 |
| 1253.0 | 63.183 |
| 1252.0 | 63.267 |
| 1251.0 | 62.885 |
| 1250.0 | 62.053 |
| 1249.0 | 60.887 |
| 1248.0 | 59.524 |
| 1247.0 | 58.146 |
| 1246.0 | 56.875 |
| 1245.0 | 55.796 |
| 1244.0 | 55.009 |
| 1243.0 | 54.579 |
| 1242.0 | 54.549 |
| 1241.0 | 54.894 |
| 1240.0 | 55.591 |
| 1239.0 | 56.552 |
| 1238.0 | 57.711 |
| 1237.0 | 58.991 |
| 1236.0 | 60.253 |
| 1235.0 | 61.356 |
| 1234.0 | 62.226 |
| 1233.0 | 62.782 |
| 1232.0 | 62.985 |
| 1231.0 | 62.876 |
| 1230.0 | 62.543 |
| 1229.0 | 62.078 |
| 1228.0 | 61.565 |
| 1227.0 | 61.114 |
| 1226.0 | 60.774 |
| 1225.0 | 60.567 |
| 1224.0 | 60.528 |
| 1223.0 | 60.64 |
| 1222.0 | 60.896 |
| 1221.0 | 61.213 |
| 1220.0 | 61.569 |
| 1219.0 | 61.9 |
| 1218.0 | 62.152 |
| 1217.0 | 62.315 |
| 1216.0 | 62.385 |
| 1215.0 | 62.381 |
| 1214.0 | 62.344 |
| 1213.0 | 62.307 |
| 1212.0 | 62.289 |
| 1211.0 | 62.312 |
| 1210.0 | 62.381 |
| 1209.0 | 62.51 |
| 1208.0 | 62.67 |
| 1207.0 | 62.797 |
| 1206.0 | 62.872 |
| 1205.0 | 62.845 |
| 1204.0 | 62.638 |
| 1203.0 | 62.203 |
| 1202.0 | 61.612 |
| 1201.0 | 60.896 |
| 1200.0 | 60.048 |
| 1199.0 | 59.094 |
| 1198.0 | 58.237 |
| 1197.0 | 57.539 |
| 1196.0 | 57.006 |
| 1195.0 | 56.705 |
| 1194.0 | 56.624 |
| 1193.0 | 56.744 |
| 1192.0 | 57.029 |
| 1191.0 | 57.448 |
| 1190.0 | 57.915 |
| 1189.0 | 58.363 |
| 1188.0 | 58.692 |
| 1187.0 | 58.865 |
| 1186.0 | 58.89 |
| 1185.0 | 58.758 |
| 1184.0 | 58.512 |
| 1183.0 | 58.183 |
| 1182.0 | 57.862 |
| 1181.0 | 57.61 |
| 1180.0 | 57.444 |
| 1179.0 | 57.389 |
| 1178.0 | 57.43 |
| 1177.0 | 57.526 |
| 1176.0 | 57.649 |
| 1175.0 | 57.746 |
| 1174.0 | 57.743 |
| 1173.0 | 57.593 |
| 1172.0 | 57.263 |
| 1171.0 | 56.752 |
| 1170.0 | 56.139 |
| 1169.0 | 55.481 |
| 1168.0 | 54.811 |
| 1167.0 | 54.284 |
| 1166.0 | 53.918 |
| 1165.0 | 53.826 |
| 1164.0 | 54.047 |
| 1163.0 | 54.574 |
| 1162.0 | 55.386 |
| 1161.0 | 56.388 |
| 1160.0 | 57.547 |
| 1159.0 | 58.702 |
| 1158.0 | 59.729 |
| 1157.0 | 60.445 |
| 1156.0 | 60.878 |
| 1155.0 | 60.993 |
| 1154.0 | 60.826 |
| 1153.0 | 60.501 |
| 1152.0 | 60.111 |
| 1151.0 | 59.772 |
| 1150.0 | 59.608 |
| 1149.0 | 59.655 |
| 1148.0 | 59.929 |
| 1147.0 | 60.382 |
| 1146.0 | 60.976 |
| 1145.0 | 61.54 |
| 1144.0 | 61.979 |
| 1143.0 | 62.216 |
| 1142.0 | 62.183 |
| 1141.0 | 61.91 |
| 1140.0 | 61.44 |
| 1139.0 | 60.901 |
| 1138.0 | 60.38 |
| 1137.0 | 60.011 |
| 1136.0 | 59.84 |
| 1135.0 | 59.968 |
| 1134.0 | 60.326 |
| 1133.0 | 60.828 |
| 1132.0 | 61.4 |
| 1131.0 | 61.921 |
| 1130.0 | 62.25 |
| 1129.0 | 62.158 |
| 1128.0 | 61.583 |
| 1127.0 | 60.59 |
| 1126.0 | 59.24 |
| 1125.0 | 57.734 |
| 1124.0 | 56.227 |
| 1123.0 | 55.052 |
| 1122.0 | 54.226 |
| 1121.0 | 53.847 |
| 1120.0 | 54.059 |
| 1119.0 | 54.779 |
| 1118.0 | 55.946 |
| 1117.0 | 57.384 |
| 1116.0 | 58.852 |
| 1115.0 | 60.045 |
| 1114.0 | 60.717 |
| 1113.0 | 60.733 |
| 1112.0 | 60.077 |
| 1111.0 | 58.952 |
| 1110.0 | 57.603 |
| 1109.0 | 56.335 |
| 1108.0 | 55.305 |
| 1107.0 | 54.735 |
| 1106.0 | 54.661 |
| 1105.0 | 55.095 |
| 1104.0 | 55.943 |
| 1103.0 | 57.049 |
| 1102.0 | 58.181 |
| 1101.0 | 58.997 |
| 1100.0 | 59.302 |
| 1099.0 | 59.054 |
| 1098.0 | 58.22 |
| 1097.0 | 56.947 |
| 1096.0 | 55.496 |
| 1095.0 | 54.157 |
| 1094.0 | 53.033 |
| 1093.0 | 52.347 |
| 1092.0 | 52.221 |
| 1091.0 | 52.644 |
| 1090.0 | 53.668 |
| 1089.0 | 55.122 |
| 1088.0 | 56.946 |
| 1087.0 | 58.674 |
| 1086.0 | 60.335 |
| 1085.0 | 61.565 |
| 1084.0 | 62.233 |
| 1083.0 | 62.34 |
| 1082.0 | 61.926 |
| 1081.0 | 61.317 |
| 1080.0 | 60.652 |
| 1079.0 | 60.162 |
| 1078.0 | 59.923 |
| 1077.0 | 60.016 |
| 1076.0 | 60.384 |
| 1075.0 | 60.925 |
| 1074.0 | 61.526 |
| 1073.0 | 62.145 |
| 1072.0 | 62.669 |
| 1071.0 | 63.053 |
| 1070.0 | 63.375 |
| 1069.0 | 63.65 |
| 1068.0 | 63.944 |
| 1067.0 | 64.265 |
| 1066.0 | 64.546 |
| 1065.0 | 64.702 |
| 1064.0 | 64.692 |
| 1063.0 | 64.388 |
| 1062.0 | 63.77 |
| 1061.0 | 62.946 |
| 1060.0 | 61.901 |
| 1059.0 | 60.963 |
| 1058.0 | 60.212 |
| 1057.0 | 59.805 |
| 1056.0 | 59.778 |
| 1055.0 | 60.13 |
| 1054.0 | 60.762 |
| 1053.0 | 61.401 |
| 1052.0 | 61.861 |
| 1051.0 | 61.772 |
| 1050.0 | 60.909 |
| 1049.0 | 59.491 |
| 1048.0 | 57.538 |
| 1047.0 | 55.52 |
| 1046.0 | 53.644 |
| 1045.0 | 52.36 |
| 1044.0 | 51.84 |
| 1043.0 | 52.145 |
| 1042.0 | 53.281 |
| 1041.0 | 54.9 |
| 1040.0 | 56.703 |
| 1039.0 | 57.836 |
| 1038.0 | 57.764 |
| 1037.0 | 56.084 |
| 1036.0 | 53.274 |
| 1035.0 | 49.84 |
| 1034.0 | 46.249 |
| 1033.0 | 43.44 |
| 1032.0 | 41.498 |
| 1031.0 | 40.79 |
| 1030.0 | 41.342 |
| 1029.0 | 43.228 |
| 1028.0 | 46.217 |
| 1027.0 | 49.999 |
| 1026.0 | 54.108 |
| 1025.0 | 57.155 |
| 1024.0 | 58.266 |
| 1023.0 | 57.389 |
| 1022.0 | 54.771 |
| 1021.0 | 51.485 |
| 1020.0 | 48.188 |
| 1019.0 | 45.739 |
| 1018.0 | 44.64 |
| 1017.0 | 44.767 |
| 1016.0 | 46.234 |
| 1015.0 | 48.823 |
| 1014.0 | 52.443 |
| 1013.0 | 56.301 |
| 1012.0 | 59.385 |
| 1011.0 | 61.254 |
| 1010.0 | 61.417 |
| 1009.0 | 60.062 |
| 1008.0 | 57.736 |
| 1007.0 | 55.555 |
| 1006.0 | 53.916 |
| 1005.0 | 53.336 |
| 1004.0 | 53.958 |
| 1003.0 | 55.787 |
| 1002.0 | 58.477 |
| 1001.0 | 61.585 |
| 1000.0 | 64.287 |
| 999.0 | 66.013 |
| 998.0 | 66.405 |
| 997.0 | 65.581 |
| 996.0 | 64.126 |
| 995.0 | 62.689 |
| 994.0 | 61.67 |
| 993.0 | 61.415 |
| 992.0 | 61.967 |
| 991.0 | 63.156 |
| 990.0 | 64.693 |
| 989.0 | 66.249 |
| 988.0 | 67.379 |
| 987.0 | 68.069 |
| 986.0 | 68.231 |
| 985.0 | 67.938 |
| 984.0 | 67.386 |
| 983.0 | 66.689 |
| 982.0 | 65.863 |
| 981.0 | 64.896 |
| 980.0 | 63.869 |
| 979.0 | 62.785 |
| 978.0 | 61.718 |
| 977.0 | 60.842 |
| 976.0 | 60.359 |
| 975.0 | 60.468 |
| 974.0 | 61.197 |
| 973.0 | 62.39 |
| 972.0 | 63.796 |
| 971.0 | 65.095 |
| 970.0 | 65.755 |
| 969.0 | 65.451 |
| 968.0 | 64.241 |
| 967.0 | 62.335 |
| 966.0 | 60.181 |
| 965.0 | 58.557 |
| 964.0 | 57.677 |
| 963.0 | 57.907 |
| 962.0 | 59.368 |
| 961.0 | 61.806 |
| 960.0 | 64.946 |
| 959.0 | 67.866 |
| 958.0 | 70.045 |
| 957.0 | 71.226 |
| 956.0 | 71.326 |
| 955.0 | 70.778 |
| 954.0 | 70.207 |
| 953.0 | 70.115 |
| 952.0 | 70.741 |
| 951.0 | 71.979 |
| 950.0 | 73.532 |
| 949.0 | 74.814 |
| 948.0 | 75.397 |
| 947.0 | 75.231 |
| 946.0 | 74.57 |
| 945.0 | 73.805 |
| 944.0 | 73.425 |
| 943.0 | 73.674 |
| 942.0 | 74.509 |
| 941.0 | 75.585 |
| 940.0 | 76.487 |
| 939.0 | 76.65 |
| 938.0 | 75.82 |
| 937.0 | 74.204 |
| 936.0 | 72.304 |
| 935.0 | 70.663 |
| 934.0 | 69.829 |
| 933.0 | 69.986 |
| 932.0 | 71.019 |
| 931.0 | 72.538 |
| 930.0 | 74.009 |
| 929.0 | 74.665 |
| 928.0 | 74.136 |
| 927.0 | 72.598 |
| 926.0 | 70.366 |
| 925.0 | 68.173 |
| 924.0 | 66.805 |
| 923.0 | 66.554 |
| 922.0 | 67.459 |
| 921.0 | 69.181 |
| 920.0 | 71.352 |
| 919.0 | 73.228 |
| 918.0 | 74.389 |
| 917.0 | 74.876 |
| 916.0 | 74.968 |
| 915.0 | 75.1 |
| 914.0 | 75.646 |
| 913.0 | 76.765 |
| 912.0 | 78.214 |
| 911.0 | 79.589 |
| 910.0 | 80.511 |
| 909.0 | 80.806 |
| 908.0 | 80.535 |
| 907.0 | 80.048 |
| 906.0 | 79.735 |
| 905.0 | 79.864 |
| 904.0 | 80.447 |
| 903.0 | 81.273 |
| 902.0 | 82.093 |
| 901.0 | 82.628 |
| 900.0 | 82.787 |
| 899.0 | 82.714 |
| 898.0 | 82.593 |
| 897.0 | 82.59 |
| 896.0 | 82.745 |
| 895.0 | 82.956 |
| 894.0 | 83.025 |
| 893.0 | 82.791 |
| 892.0 | 82.201 |
| 891.0 | 81.35 |
| 890.0 | 80.379 |
| 889.0 | 79.415 |
| 888.0 | 78.519 |
| 887.0 | 77.618 |
| 886.0 | 76.555 |
| 885.0 | 75.237 |
| 884.0 | 73.735 |
| 883.0 | 72.34 |
| 882.0 | 71.351 |
| 881.0 | 70.913 |
| 880.0 | 71.008 |
| 879.0 | 71.324 |
| 878.0 | 71.366 |
| 877.0 | 70.753 |
| 876.0 | 69.35 |
| 875.0 | 67.347 |
| 874.0 | 65.315 |
| 873.0 | 63.98 |
| 872.0 | 63.77 |
| 871.0 | 64.798 |
| 870.0 | 66.653 |
| 869.0 | 68.563 |
| 868.0 | 69.87 |
| 867.0 | 70.196 |
| 866.0 | 69.624 |
| 865.0 | 68.457 |
| 864.0 | 67.368 |
| 863.0 | 67.037 |
| 862.0 | 67.699 |
| 861.0 | 69.406 |
| 860.0 | 72.764 |
| 859.0 | 79.321 |
| 858.0 | 85.981 |
| 857.0 | 88.243 |
| 856.0 | 86.616 |
| 855.0 | 83.931 |
| 854.0 | 82.673 |
| 853.0 | 83.574 |
| 852.0 | 85.879 |
| 851.0 | 87.561 |
| 850.0 | 86.866 |
| 849.0 | 83.675 |
| 848.0 | 79.591 |
| 847.0 | 76.795 |
| 846.0 | 76.712 |
| 845.0 | 79.348 |
| 844.0 | 83.009 |
| 843.0 | 84.85 |
| 842.0 | 82.785 |
| 841.0 | 76.954 |
| 840.0 | 69.422 |
| 839.0 | 62.86 |
| 838.0 | 58.806 |
| 837.0 | 57.537 |
| 836.0 | 58.745 |
| 835.0 | 61.511 |
| 834.0 | 64.76 |
| 833.0 | 67.46 |
| 832.0 | 68.997 |
| 831.0 | 69.452 |
| 830.0 | 69.123 |
| 829.0 | 68.411 |
| 828.0 | 67.715 |
| 827.0 | 67.338 |
| 826.0 | 67.812 |
| 825.0 | 69.754 |
| 824.0 | 73.421 |
| 823.0 | 78.438 |
| 822.0 | 83.725 |
| 821.0 | 87.594 |
| 820.0 | 88.945 |
| 819.0 | 88.323 |
| 818.0 | 87.555 |
| 817.0 | 88.326 |
| 816.0 | 90.903 |
| 815.0 | 93.376 |
| 814.0 | 92.708 |
| 813.0 | 87.856 |
| 812.0 | 80.448 |
| 811.0 | 73.485 |
| 810.0 | 69.339 |
| 809.0 | 68.658 |
| 808.0 | 70.24 |
| 807.0 | 71.423 |
| 806.0 | 69.761 |
| 805.0 | 65.207 |
| 804.0 | 60.37 |
| 803.0 | 57.729 |
| 802.0 | 58.347 |
| 801.0 | 61.426 |
| 800.0 | 63.85 |
| 799.0 | 61.836 |
| 798.0 | 54.917 |
| 797.0 | 46.448 |
| 796.0 | 40.321 |
| 795.0 | 38.375 |
| 794.0 | 41.047 |
| 793.0 | 48.01 |
| 792.0 | 56.881 |
| 791.0 | 62.126 |
| 790.0 | 59.65 |
| 789.0 | 51.701 |
| 788.0 | 44.125 |
| 787.0 | 40.544 |
| 786.0 | 41.94 |
| 785.0 | 48.296 |
| 784.0 | 58.113 |
| 783.0 | 67.928 |
| 782.0 | 73.317 |
| 781.0 | 72.785 |
| 780.0 | 69.127 |
| 779.0 | 66.203 |
| 778.0 | 66.187 |
| 777.0 | 69.553 |
| 776.0 | 75.584 |
| 775.0 | 82.778 |
| 774.0 | 89.037 |
| 773.0 | 92.132 |
| 772.0 | 91.069 |
| 771.0 | 87.186 |
| 770.0 | 83.273 |
| 769.0 | 82.196 |
| 768.0 | 85.141 |
| 767.0 | 89.891 |
| 766.0 | 91.196 |
| 765.0 | 85.906 |
| 764.0 | 76.507 |
| 763.0 | 68.377 |
| 762.0 | 65.298 |
| 761.0 | 67.894 |
| 760.0 | 73.872 |
| 759.0 | 77.587 |
| 758.0 | 74.45 |
| 757.0 | 66.253 |
| 756.0 | 59.329 |
| 755.0 | 57.882 |
| 754.0 | 62.954 |
| 753.0 | 72.606 |
| 752.0 | 81.184 |
| 751.0 | 83.298 |
| 750.0 | 79.595 |
| 749.0 | 76.034 |
| 748.0 | 77.684 |
| 747.0 | 84.737 |
| 746.0 | 91.306 |
| 745.0 | 91.367 |
| 744.0 | 85.889 |
| 743.0 | 81.005 |
| 742.0 | 81.4 |
| 741.0 | 86.71 |
| 740.0 | 91.11 |
| 739.0 | 88.254 |
| 738.0 | 79.092 |
| 737.0 | 70.437 |
| 736.0 | 67.358 |
| 735.0 | 70.121 |
| 734.0 | 74.652 |
| 733.0 | 75.549 |
| 732.0 | 70.995 |
| 731.0 | 63.883 |
| 730.0 | 58.197 |
| 729.0 | 55.89 |
| 728.0 | 56.543 |
| 727.0 | 58.797 |
| 726.0 | 61.46 |
| 725.0 | 63.495 |
| 724.0 | 63.854 |
| 723.0 | 62.188 |
| 722.0 | 59.324 |
| 721.0 | 57.62 |
| 720.0 | 59.915 |
| 719.0 | 67.93 |
| 718.0 | 78.63 |
| 717.0 | 83.95 |
| 716.0 | 79.329 |
| 715.0 | 70.823 |
| 714.0 | 67.611 |
| 713.0 | 73.239 |
| 712.0 | 84.36 |
| 711.0 | 91.232 |
| 710.0 | 87.421 |
| 709.0 | 78.68 |
| 708.0 | 75.893 |
| 707.0 | 81.462 |
| 706.0 | 86.096 |
| 705.0 | 79.261 |
| 704.0 | 64.399 |
| 703.0 | 52.509 |
| 702.0 | 48.627 |
| 701.0 | 51.255 |
| 700.0 | 54.974 |
| 699.0 | 53.764 |
| 698.0 | 47.55 |
| 697.0 | 41.9 |
| 696.0 | 40.756 |
| 695.0 | 43.592 |
| 694.0 | 46.822 |
| 693.0 | 47.175 |
| 692.0 | 44.891 |
| 691.0 | 42.933 |
| 690.0 | 43.554 |
| 689.0 | 46.303 |
| 688.0 | 48.676 |
| 687.0 | 49.536 |
| 686.0 | 49.798 |
| 685.0 | 51.419 |
| 684.0 | 54.66 |
| 683.0 | 58.012 |
| 682.0 | 60.331 |
| 681.0 | 62.465 |
| 680.0 | 66.163 |
| 679.0 | 71.867 |
| 678.0 | 77.974 |
| 677.0 | 82.243 |
| 676.0 | 84.455 |
| 675.0 | 86.673 |
| 674.0 | 89.905 |
| 673.0 | 93.711 |
| 672.0 | 96.478 |
| 671.0 | 95.874 |
| 670.0 | 90.878 |
| 669.0 | 83.602 |
| 668.0 | 78.671 |
| 667.0 | 79.898 |
| 666.0 | 86.829 |
| 665.0 | 93.538 |
| 664.0 | 93.034 |
| 663.0 | 87.165 |
| 662.0 | 83.228 |
| 661.0 | 85.776 |
| 660.0 | 92.421 |
| 659.0 | 95.605 |
| 658.0 | 92.271 |
| 657.0 | 88.187 |
| 656.0 | 88.921 |
| 655.0 | 93.568 |
| 654.0 | 96.593 |
| 653.0 | 95.318 |
| 652.0 | 92.709 |
| 651.0 | 92.663 |
| 650.0 | 94.646 |
| 649.0 | 95.291 |
| 648.0 | 92.552 |
| 647.0 | 88.553 |
| 646.0 | 87.013 |
| 645.0 | 89.37 |
| 644.0 | 92.849 |
| 643.0 | 93.45 |
| 642.0 | 90.171 |
| 641.0 | 86.363 |
| 640.0 | 86.543 |
| 639.0 | 91.46 |
| 638.0 | 95.323 |
| 637.0 | 93.497 |
| 636.0 | 89.252 |
| 635.0 | 88.964 |
| 634.0 | 92.997 |
| 633.0 | 96.008 |
| 632.0 | 94.854 |
| 631.0 | 93.327 |
| 630.0 | 94.815 |
| 629.0 | 95.591 |
| 628.0 | 90.876 |
| 627.0 | 84.952 |
| 626.0 | 85.168 |
| 625.0 | 90.841 |
| 624.0 | 92.716 |
| 623.0 | 86.823 |
| 622.0 | 80.674 |
| 621.0 | 82.079 |
| 620.0 | 88.924 |
| 619.0 | 91.913 |
| 618.0 | 88.02 |
| 617.0 | 84.288 |
| 616.0 | 86.775 |
| 615.0 | 92.821 |
| 614.0 | 96.23 |
| 613.0 | 95.924 |
| 612.0 | 95.466 |
| 611.0 | 96.588 |
| 610.0 | 97.531 |
| 609.0 | 96.198 |
| 608.0 | 93.012 |
| 607.0 | 90.969 |
| 606.0 | 92.342 |
| 605.0 | 95.497 |
| 604.0 | 97.022 |
| 603.0 | 95.923 |
| 602.0 | 94.683 |
| 601.0 | 95.553 |
| 600.0 | 97.462 |
| 599.0 | 97.718 |
| 598.0 | 96.811 |
| 597.0 | 96.986 |
| 596.0 | 98.137 |
| 595.0 | 98.786 |
| 594.0 | 98.706 |
| 593.0 | 98.651 |
| 592.0 | 99.026 |
| 591.0 | 99.425 |
| 590.0 | 99.434 |
| 589.0 | 99.389 |
| 588.0 | 99.434 |
| 587.0 | 99.434 |
| 586.0 | 99.423 |
| 585.0 | 99.557 |
| 584.0 | 99.493 |
| 583.0 | 99.411 |
| 582.0 | 99.47 |
| 581.0 | 99.473 |
| 580.0 | 99.461 |
| 579.0 | 99.547 |
| 578.0 | 99.513 |
| 577.0 | 99.402 |
| 576.0 | 99.451 |
| 575.0 | 99.536 |
| 574.0 | 99.514 |
| 573.0 | 99.514 |
| 572.0 | 99.483 |
| 571.0 | 99.499 |
| 570.0 | 97.815 |
| 569.0 | 97.631 |
| 568.0 | 97.899 |
| 567.0 | 97.955 |
| 566.0 | 98.605 |
| 565.0 | 97.371 |
| 564.0 | 97.724 |
| 563.0 | 99.069 |
| 562.0 | 97.464 |
| 561.0 | 97.82 |
| 560.0 | 97.779 |
| 559.0 | 97.798 |
| 558.0 | 98.145 |
| 557.0 | 97.838 |
| 556.0 | 97.745 |
| 555.0 | 97.473 |
| 554.0 | 98.063 |
| 553.0 | 97.706 |
| 552.0 | 98.134 |
| 551.0 | 98.236 |
| 550.0 | 98.159 |
| 549.0 | 98.355 |
| 548.0 | 98.023 |
| 547.0 | 98.334 |
| 546.0 | 99.086 |
| 545.0 | 98.639 |
| 544.0 | 98.315 |
| 543.0 | 97.711 |
| 542.0 | 99.074 |
| 541.0 | 97.452 |
| 540.0 | 97.825 |
| 539.0 | 97.767 |
| 538.0 | 97.803 |
| 537.0 | 98.133 |
| 536.0 | 97.843 |
| 535.0 | 97.733 |
| 534.0 | 97.478 |
| 533.0 | 98.051 |
| 532.0 | 97.711 |
| 531.0 | 98.121 |
| 530.0 | 97.741 |
| 529.0 | 97.646 |
| 528.0 | 97.86 |
| 527.0 | 97.511 |
| 526.0 | 98.339 |
| 525.0 | 98.543 |
| 524.0 | 98.644 |
| 523.0 | 98.302 |
| 522.0 | 98.339 |
| 521.0 | 99.074 |
| 520.0 | 98.644 |
| 519.0 | 98.302 |
| 518.0 | 97.82 |
| 517.0 | 97.668 |
| 516.0 | 97.946 |
| 515.0 | 97.96 |
| 514.0 | 98.642 |
| 513.0 | 97.419 |
| 512.0 | 97.729 |
| 511.0 | 99.106 |
| 510.0 | 97.512 |
| 509.0 | 98.825 |
| 508.0 | 98.817 |
| 507.0 | 97.845 |
| 506.0 | 98.15 |
| 505.0 | 97.876 |
| 504.0 | 97.792 |
| 503.0 | 97.477 |
| 502.0 | 98.101 |
| 501.0 | 97.754 |
| 500.0 | 98.138 |
| 499.0 | 97.773 |
| 498.0 | 97.706 |
| 497.0 | 97.86 |
| 496.0 | 97.56 |
| 495.0 | 97.482 |
| 494.0 | 97.81 |
| 493.0 | 97.776 |
| 492.0 | 97.462 |
| 491.0 | 97.816 |
| 490.0 | 98.211 |
| 489.0 | 97.6 |
| 488.0 | 97.93 |
| 487.0 | 97.905 |
| 486.0 | 97.95 |
| 485.0 | 97.237 |
| 484.0 | 97.881 |
| 483.0 | 97.78 |
| 482.0 | 97.482 |
| 481.0 | 98.088 |
| 480.0 | 97.759 |
| 479.0 | 98.126 |
| 478.0 | 97.778 |
| 477.0 | 97.694 |
| 476.0 | 97.865 |
| 475.0 | 97.548 |
| 474.0 | 98.387 |
| 473.0 | 98.56 |
| 472.0 | 98.681 |
| 471.0 | 98.35 |
| 470.0 | 98.344 |
| 469.0 | 99.111 |
| 468.0 | 98.691 |
| 467.0 | 98.307 |
| 466.0 | 98.175 |
| 465.0 | 97.928 |
| 464.0 | 97.785 |
| 463.0 | 97.52 |
| 462.0 | 98.136 |
| 461.0 | 97.764 |
| 460.0 | 98.164 |
| 459.0 | 97.826 |
| 458.0 | 97.699 |
| 457.0 | 97.902 |
| 456.0 | 97.596 |
| 455.0 | 97.992 |
| 454.0 | 97.716 |
| 453.0 | 97.329 |
| 452.0 | 97.955 |
| 451.0 | 97.981 |
| 450.0 | 98.759 |
| 449.0 | 98.296 |
| 448.0 | 97.945 |
| 447.0 | 97.902 |
| 446.0 | 97.822 |
| 445.0 | 97.933 |
| 444.0 | 97.822 |
| 443.0 | 97.567 |
| 442.0 | 98.141 |
| 441.0 | 97.801 |
| 440.0 | 98.211 |
| 439.0 | 98.33 |
| 438.0 | 98.236 |
| 437.0 | 98.449 |
| 436.0 | 98.1 |
| 435.0 | 98.429 |
| 434.0 | 99.164 |
| 433.0 | 98.734 |
| 432.0 | 98.392 |
| 431.0 | 98.429 |
| 430.0 | 99.164 |
| 429.0 | 98.734 |
| 428.0 | 98.392 |
| 427.0 | 98.137 |
| 426.0 | 98.381 |
| 425.0 | 98.28 |
| 424.0 | 97.982 |
| 423.0 | 97.802 |
| 422.0 | 97.759 |
| 421.0 | 97.736 |
| 420.0 | 97.949 |
| 419.0 | 97.6 |
| 418.0 | 98.429 |
| 417.0 | 98.305 |
| 416.0 | 98.35 |
| 415.0 | 99.574 |
| 414.0 | 97.952 |
| 413.0 | 98.325 |
| 412.0 | 98.267 |
| 411.0 | 89.859 |
| 410.0 | 17.67 |
| 409.0 | 0.241 |
| 408.0 | 0.018 |
| 407.0 | 0.001 |
| 406.0 | 0 |
| 405.0 | 0 |
| 404.0 | 0 |
| 403.0 | 0 |
| 402.0 | 0.001 |
| 401.0 | 0.025 |
| 400.0 | 0.179 |
| 399.0 | 22.507 |
| 398.0 | 91.45 |
| 397.0 | 98.051 |
| 396.0 | 98.38 |
| 395.0 | 98.283 |
| 394.0 | 98.305 |
| 393.0 | 97.646 |
| 392.0 | 97.86 |
| 391.0 | 97.511 |
| 390.0 | 98.042 |
| 389.0 | 97.416 |
| 388.0 | 97.825 |
| 387.0 | 97.767 |
| 386.0 | 97.803 |
| 385.0 | 97.636 |
| 384.0 | 97.887 |
| 383.0 | 97.96 |
| 382.0 | 98.593 |
| 381.0 | 97.376 |
| 380.0 | 97.711 |
| 379.0 | 99.074 |
| 378.0 | 97.452 |
| 377.0 | 97.825 |
| 376.0 | 97.767 |
| 375.0 | 97.803 |
| 374.0 | 98.133 |
| 373.0 | 97.843 |
| 372.0 | 97.733 |
| 371.0 | 97.478 |
| 370.0 | 98.051 |
| 369.0 | 97.711 |
| 368.0 | 98.121 |
| 367.0 | 97.741 |
| 366.0 | 97.646 |
| 365.0 | 97.86 |
| 364.0 | 97.511 |
| 363.0 | 98.339 |
| 362.0 | 99.074 |
| 361.0 | 98.644 |
| 360.0 | 98.302 |
| 359.0 | 97.662 |
| 358.0 | 97.68 |
| 357.0 | 97.415 |
| 356.0 | 96.473 |
| 355.0 | 94.78 |
| 354.0 | 91.907 |
| 353.0 | 87.507 |
| 352.0 | 81.676 |
| 351.0 | 74.979 |
| 350.0 | 68.56 |
| 349.0 | 65.752 |
| 348.0 | 67.962 |
| 347.0 | 71.723 |
| 346.0 | 73.288 |
| 345.0 | 72.685 |
| 344.0 | 72.44 |
| 343.0 | 72.423 |
| 342.0 | 70.307 |
| 341.0 | 66.612 |
| 340.0 | 63.122 |
| 339.0 | 59.442 |
| 338.0 | 54.21 |
| 337.0 | 48.97 |
| 336.0 | 46.063 |
| 335.0 | 44.589 |
| 334.0 | 42.167 |
| 333.0 | 37.76 |
| 332.0 | 33.075 |
| 331.0 | 30.259 |
| 330.0 | 28.816 |
| 329.0 | 27.426 |
| 328.0 | 25.281 |
| 327.0 | 22.58 |
| 326.0 | 19.922 |
| 325.0 | 17.815 |
| 324.0 | 16.534 |
| 323.0 | 15.377 |
| 322.0 | 14.161 |
| 321.0 | 13.592 |
| 320.0 | 14.766 |
| 319.0 | 16.956 |
| 318.0 | 17.993 |
| 317.0 | 17.231 |
| 316.0 | 15.596 |
| 315.0 | 14.201 |
| 314.0 | 13.305 |
| 313.0 | 11.894 |
| 312.0 | 10.042 |
| 311.0 | 8.939 |
| 310.0 | 7.867 |
| 309.0 | 5.521 |
| 308.0 | 2.887 |
| 307.0 | 1.328 |
| 306.0 | 0.657 |
| 305.0 | 0.273 |
| 304.0 | 0.058 |
| 303.0 | 0.006 |
| 302.0 | 0.003 |
| 301.0 | 0.003 |
| 300.0 | 0.002 |
| 299.0 | 0.004 |
| 298.0 | 0.007 |
| 297.0 | 0 |
| 296.0 | 0.004 |
| 295.0 | 0 |
| 294.0 | 0.001 |
| 293.0 | 0.004 |
| 292.0 | 0.005 |
| 291.0 | 0.003 |
| 290.0 | 0.004 |
| 289.0 | 0 |
| 288.0 | 0.003 |
| 287.0 | 0.004 |
| 286.0 | 0.007 |
| 285.0 | 0.001 |
| 284.0 | 0.005 |
| 283.0 | 0 |
| 282.0 | 0.001 |
| 281.0 | 0.004 |
| 280.0 | 0.007 |
| 279.0 | 0.002 |
| 278.0 | 0.007 |
| 277.0 | 0 |
| 276.0 | 0.002 |
| 275.0 | 0.004 |
| 274.0 | 0.007 |
| 273.0 | 0 |
| 272.0 | 0.005 |
| 271.0 | 0 |
| 270.0 | 0.001 |
| 269.0 | 0.005 |
| 268.0 | 0.007 |
| 267.0 | 0.001 |
| 266.0 | 0.002 |
| 265.0 | 0.002 |
| 264.0 | 0.001 |
| 263.0 | 0.005 |
| 262.0 | 0.007 |
| 261.0 | 0.002 |
| 260.0 | 0.006 |
| 259.0 | 0.001 |
| 258.0 | 0.001 |
| 257.0 | 0.006 |
| 256.0 | 0.005 |
| 255.0 | 0.005 |
| 254.0 | 0.005 |
| 253.0 | 0.002 |
| 252.0 | 0.002 |
| 251.0 | 0.006 |
| 250.0 | 0.005 |
| 249.0 | 0.003 |
| 248.0 | 0.006 |
| 247.0 | 0.001 |
| 246.0 | 0 |
| 245.0 | 0.006 |
| 244.0 | 0.005 |
| 243.0 | 0.003 |
| 242.0 | 0.005 |
| 241.0 | 0.002 |
| 240.0 | 0.001 |
| 239.0 | 0.006 |
| 238.0 | 0.005 |
| 237.0 | 0.005 |
| 236.0 | 0.005 |
| 235.0 | 0.002 |
| 234.0 | 0.001 |
| 233.0 | 0.006 |
| 232.0 | 0.006 |
| 231.0 | 0.004 |
| 230.0 | 0.006 |
| 229.0 | 0.002 |
| 228.0 | 0.002 |
| 227.0 | 0.007 |
| 226.0 | 0.005 |
| 225.0 | 0.003 |
| 224.0 | 0.006 |
| 223.0 | 0.002 |
| 222.0 | 0.002 |
| 221.0 | 0.006 |
| 220.0 | 0.007 |
| 219.0 | 0.002 |
| 218.0 | 0.006 |
| 217.0 | 0.001 |
| 216.0 | 0.003 |
| 215.0 | 0.005 |
| 214.0 | 0.006 |
| 213.0 | 0.005 |
| 212.0 | 0.006 |
| 211.0 | 0.001 |
| 210.0 | 0.003 |
| 209.0 | 0.006 |
| 208.0 | 0.008 |
| 207.0 | 0.003 |
| 206.0 | 0.007 |
| 205.0 | 0.003 |
| 204.0 | 0.004 |
| 203.0 | 0.007 |
| 202.0 | 0.009 |
| 201.0 | 0.008 |
| 200.0 | 0.011 |